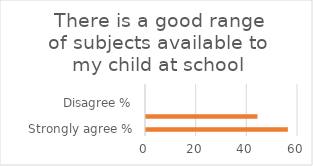
| Category | Series 1 |
|---|---|
| Strongly agree % | 56 |
| Agree % | 44 |
| Disagree % | 0 |
| Strongly disagree % | 0 |